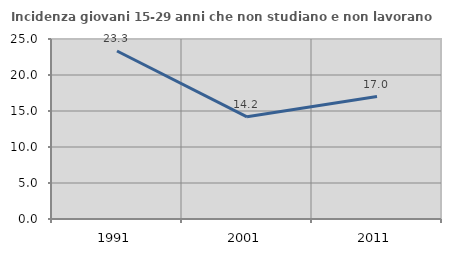
| Category | Incidenza giovani 15-29 anni che non studiano e non lavorano  |
|---|---|
| 1991.0 | 23.333 |
| 2001.0 | 14.195 |
| 2011.0 | 17.002 |